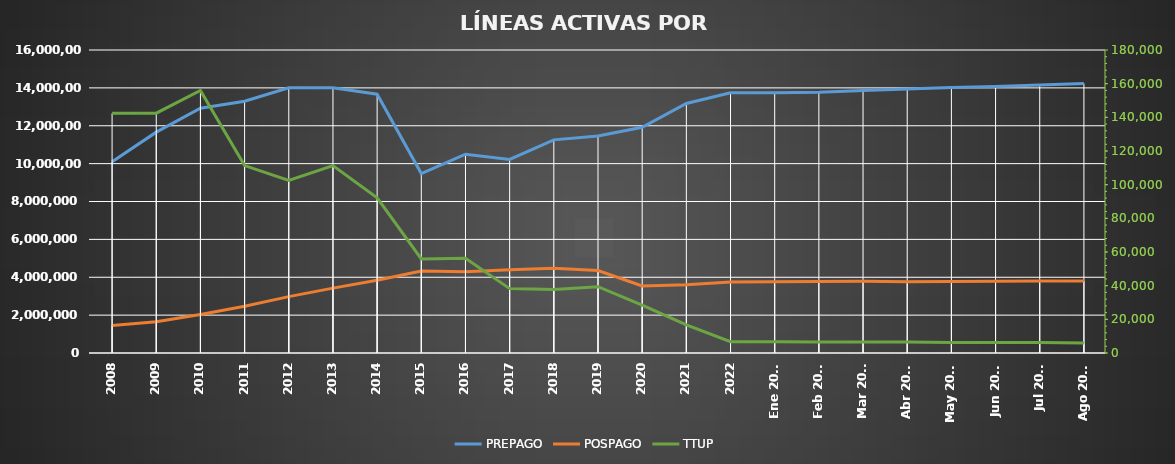
| Category | PREPAGO | POSPAGO |
|---|---|---|
| 2008 | 10097768 | 1452088 |
| 2009 | 11662294 | 1649838 |
| 2010 | 12929040 | 2033814 |
| 2011 | 13295834 | 2467378 |
| 2012 | 14008104 | 2976194 |
| 2013 | 14005126 | 3425277 |
| 2014 | 13666071 | 3846271 |
| 2015 | 9476240 | 4326937 |
| 2016 | 10498467 | 4293426 |
| 2017 | 10219457 | 4393703 |
| 2018 | 11254168 | 4480975 |
| 2019 | 11462048 | 4351686 |
| 2020 | 11917697 | 3539192 |
| 2021 | 13174530 | 3598383 |
| 2022 | 13740159 | 3743849 |
| Ene 2023 | 13744592 | 3762200 |
| Feb 2023 | 13771967 | 3773530 |
| Mar 2023 | 13859395 | 3786936 |
| Abr 2023 | 13944065 | 3768457 |
| May 2023 | 14014722 | 3780848 |
| Jun 2023 | 14075353 | 3791176 |
| Jul 2023 | 14147912 | 3799557 |
| Ago 2023 | 14231611 | 3807034 |